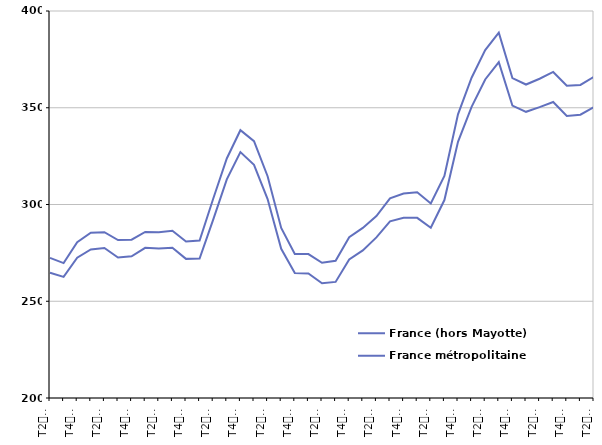
| Category | France (hors Mayotte) | France métropolitaine |
|---|---|---|
| T2
2013 | 272.4 | 264.7 |
| T3
2013 | 269.7 | 262.6 |
| T4
2013 | 280.5 | 272.5 |
| T1
2014 | 285.4 | 276.8 |
| T2
2014 | 285.7 | 277.5 |
| T3
2014 | 281.6 | 272.6 |
| T4
2014 | 281.8 | 273.2 |
| T1
2015 | 285.8 | 277.6 |
| T2
2015 | 285.7 | 277.3 |
| T3
2015 | 286.4 | 277.6 |
| T4
2015 | 280.9 | 271.9 |
| T1
2016 | 281.4 | 272.1 |
| T2
2016 | 303 | 292.2 |
| T3
2016 | 323.8 | 313 |
| T4
2016 | 338.4 | 327.1 |
| T1
2017 | 332.7 | 320.5 |
| T2
2017 | 314.6 | 302.8 |
| T3
2017 | 287.9 | 277.1 |
| T4
2017 | 274.4 | 264.6 |
| T1
2018 | 274.4 | 264.4 |
| T2
2018 | 269.9 | 259.3 |
| T3
2018 | 270.9 | 260 |
| T4
2018 | 283.1 | 271.6 |
| T1
2019 | 287.9 | 276.3 |
| T2
2019 | 294 | 283 |
| T3
2019 | 303.2 | 291.3 |
| T4
2019 | 305.7 | 293.1 |
| T1
2020 | 306.3 | 293.1 |
| T2
2020 | 300.5 | 288 |
| T3
2020 | 314.8 | 302.3 |
| T4
2020 | 346.6 | 332.4 |
| T1
2021 | 365.5 | 350.5 |
| T2
2021 | 379.8 | 364.6 |
| T3
2021 | 388.8 | 373.6 |
| T4
2021 | 365.3 | 351.1 |
| T1
2022 | 362 | 347.9 |
| T2
2022 | 365 | 350.3 |
| T3
2022 | 368.5 | 353 |
| T4
2022 | 361.4 | 345.8 |
| T1
2023 | 361.8 | 346.4 |
| T2
2023 | 366 | 350.4 |